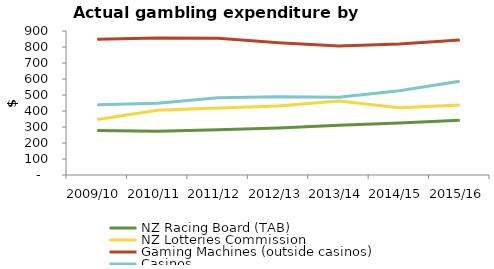
| Category | NZ Racing Board (TAB) | NZ Lotteries Commission | Gaming Machines (outside casinos) | Casinos |
|---|---|---|---|---|
| 2009/10 | 278.393 | 346.622 | 849.163 | 439.795 |
| 2010/11 | 272.793 | 404.477 | 856.099 | 448.337 |
| 2011/12 | 282.951 | 418.739 | 853.954 | 482.662 |
| 2012/13 | 294.285 | 431.824 | 826.779 | 489.573 |
| 2013/14 | 310.171 | 463.06 | 806.271 | 485.655 |
| 2014/15 | 325.051 | 420.377 | 818.113 | 527.104 |
| 2015/16 | 342.291 | 437.262 | 843.482 | 585.622 |